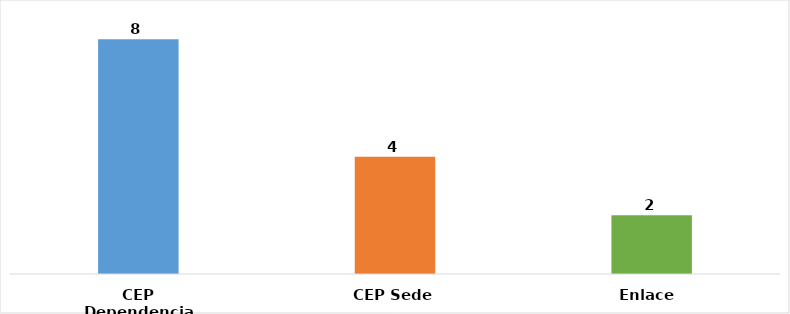
| Category | Total |
|---|---|
| CEP Dependencia | 8 |
| CEP Sede | 4 |
| Enlace  | 2 |